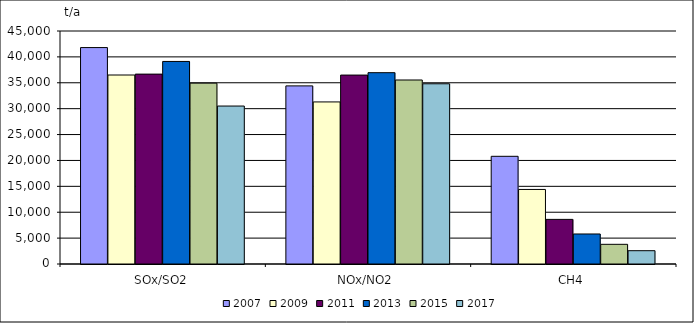
| Category | 2007 | 2009 | 2011 | 2013 | 2015 | 2017 |
|---|---|---|---|---|---|---|
| SOx/SO2 | 41800 | 36500 | 36674 | 39120 | 34928 | 30508 |
| NOx/NO2 | 34400 | 31300 | 36489 | 36949 | 35539 | 34808 |
| CH4 | 20800 | 14400 | 8617 | 5800 | 3800 | 2569 |